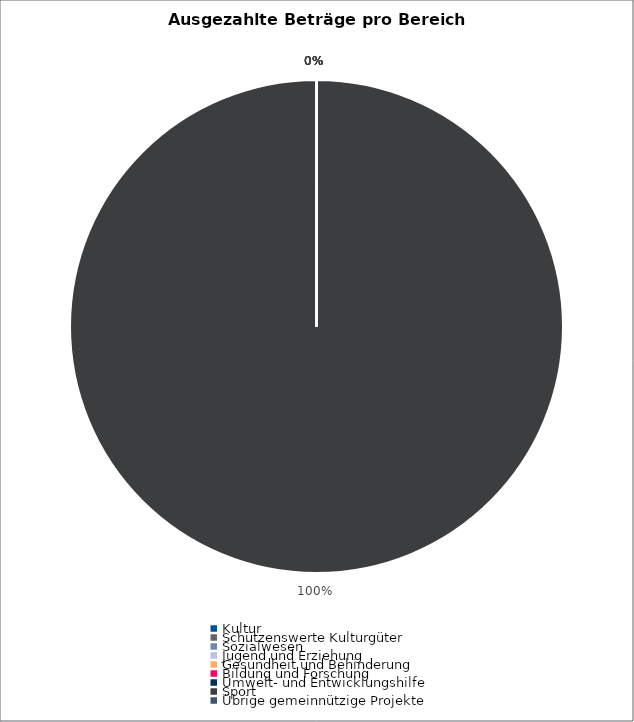
| Category | Series 0 |
|---|---|
| Kultur | 0 |
| Schützenswerte Kulturgüter | 0 |
| Sozialwesen | 0 |
| Jugend und Erziehung | 0 |
| Gesundheit und Behinderung | 0 |
| Bildung und Forschung | 0 |
| Umwelt- und Entwicklungshilfe | 0 |
| Sport | 27153527.46 |
| Übrige gemeinnützige Projekte | 0 |